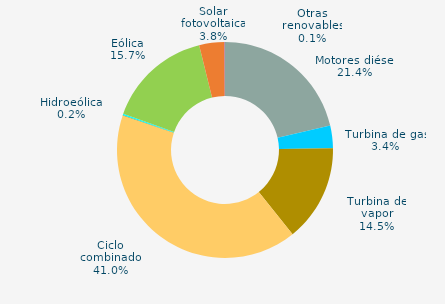
| Category | Series 0 |
|---|---|
| Motores diésel | 21.367 |
| Turbina de gas | 3.372 |
| Turbina de vapor | 14.5 |
| Ciclo combinado | 40.953 |
| Cogeneración | 0 |
| Hidráulica | 0.041 |
| Hidroeólica | 0.205 |
| Eólica | 15.712 |
| Solar fotovoltaica | 3.778 |
| Otras renovables | 0.072 |